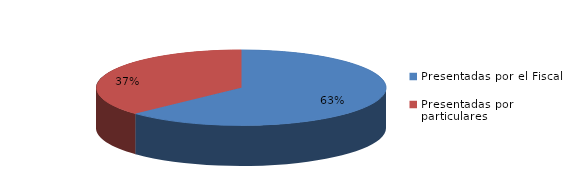
| Category | Series 0 |
|---|---|
| Presentadas por el Fiscal | 197 |
| Presentadas por particulares | 116 |